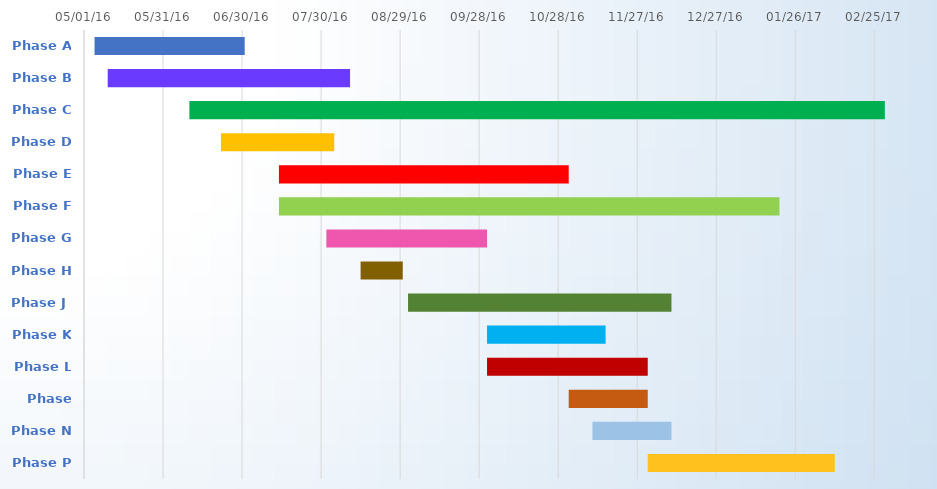
| Category | BEGIN | Duration |
|---|---|---|
| Phase A | 2016-05-05 | 57 |
| Phase B | 2016-05-10 | 92 |
| Phase C | 2016-06-10 | 264 |
| Phase D | 2016-06-22 | 43 |
| Phase E | 2016-07-14 | 110 |
| Phase F | 2016-07-14 | 190 |
| Phase G | 2016-08-01 | 61 |
| Phase H | 2016-08-14 | 16 |
| Phase J | 2016-09-01 | 100 |
| Phase K | 2016-10-01 | 45 |
| Phase L | 2016-10-01 | 61 |
| Phase M | 2016-11-01 | 30 |
| Phase N | 2016-11-10 | 30 |
| Phase P | 2016-12-01 | 71 |